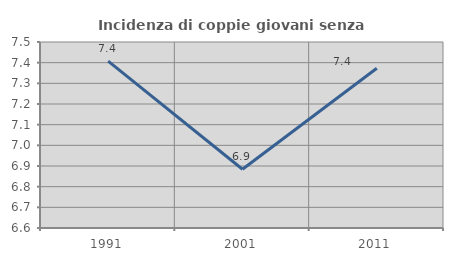
| Category | Incidenza di coppie giovani senza figli |
|---|---|
| 1991.0 | 7.407 |
| 2001.0 | 6.884 |
| 2011.0 | 7.373 |